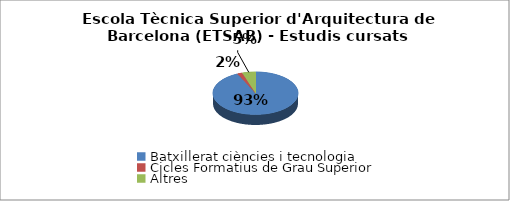
| Category | Escola Tècnica Superior d'Arquitectura de Barcelona (ETSAB) - Estudis cursats |
|---|---|
| Batxillerat ciències i tecnologia | 0.93 |
| Cicles Formatius de Grau Superior | 0.019 |
| Altres | 0.051 |